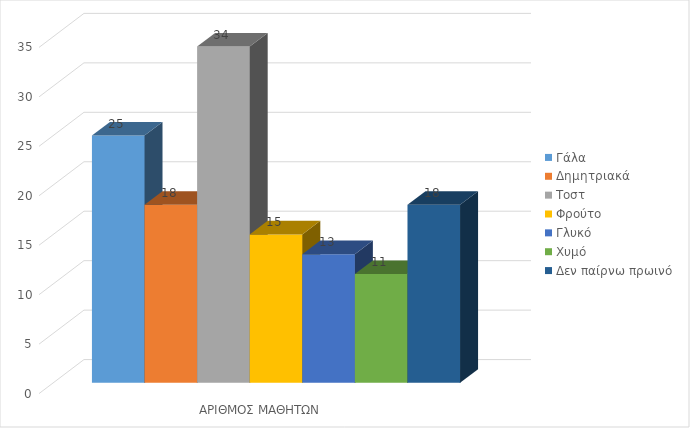
| Category | Γάλα | Δημητριακά  | Τοστ | Φρούτο | Γλυκό | Χυμό | Δεν παίρνω πρωινό |
|---|---|---|---|---|---|---|---|
| ΑΡΙΘΜΟΣ ΜΑΘΗΤΩΝ | 25 | 18 | 34 | 15 | 13 | 11 | 18 |